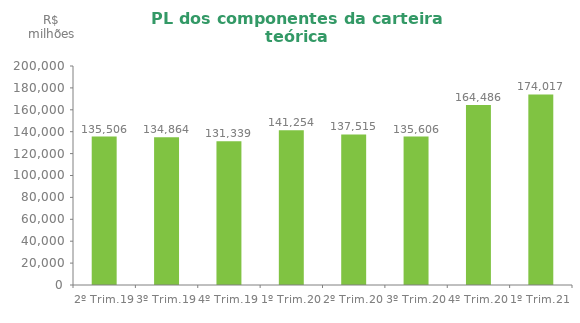
| Category | Series 0 |
|---|---|
| 2º Trim.19 | 135505.78 |
| 3º Trim.19 | 134863.51 |
| 4º Trim.19 | 131338.794 |
| 1º Trim.20 | 141254.49 |
| 2º Trim.20 | 137515.45 |
| 3º Trim.20 | 135605.88 |
| 4º Trim.20 | 164486.25 |
| 1º Trim.21 | 174016.57 |